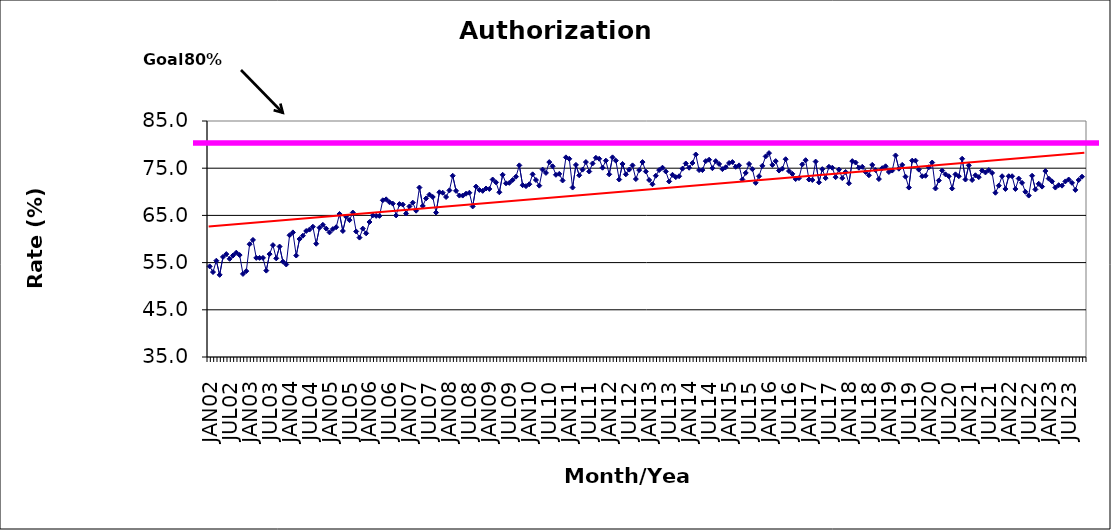
| Category | Series 0 |
|---|---|
| JAN02 | 54.2 |
| FEB02 | 53 |
| MAR02 | 55.4 |
| APR02 | 52.4 |
| MAY02 | 56.2 |
| JUN02 | 56.8 |
| JUL02 | 55.8 |
| AUG02 | 56.5 |
| SEP02 | 57.1 |
| OCT02 | 56.6 |
| NOV02 | 52.6 |
| DEC02 | 53.2 |
| JAN03 | 58.9 |
| FEB03 | 59.8 |
| MAR03 | 56 |
| APR03 | 56 |
| MAY03 | 56 |
| JUN03 | 53.3 |
| JUL03 | 56.8 |
| AUG03 | 58.7 |
| SEP03 | 55.9 |
| OCT03 | 58.4 |
| NOV03 | 55.2 |
| DEC03 | 54.6 |
| JAN04 | 60.8 |
| FEB04 | 61.4 |
| MAR04 | 56.5 |
| APR04 | 60 |
| MAY04 | 60.7 |
| JUN04 | 61.7 |
| JUL04 | 62 |
| AUG04 | 62.6 |
| SEP04 | 59 |
| OCT04 | 62.4 |
| NOV04 | 63 |
| DEC04 | 62.2 |
| JAN05 | 61.4 |
| FEB05 | 62.1 |
| MAR05 | 62.5 |
| APR05 | 65.3 |
| MAY05 | 61.7 |
| JUN05 | 64.7 |
| JUL05 | 64 |
| AUG05 | 65.6 |
| SEP05 | 61.6 |
| OCT05 | 60.3 |
| NOV05 | 62.2 |
| DEC05 | 61.2 |
| JAN06 | 63.6 |
| FEB06 | 65 |
| MAR06 | 64.9 |
| APR06 | 64.9 |
| MAY06 | 68.2 |
| JUN06 | 68.4 |
| JUL06 | 67.8 |
| AUG06 | 67.5 |
| SEP06 | 65 |
| OCT06 | 67.4 |
| NOV06 | 67.3 |
| DEC06 | 65.4 |
| JAN07 | 66.9 |
| FEB07 | 67.7 |
| MAR07 | 66 |
| APR07 | 70.9 |
| MAY07 | 67 |
| JUN07 | 68.6 |
| JUL07 | 69.4 |
| AUG07 | 68.9 |
| SEP07 | 65.6 |
| OCT07 | 69.9 |
| NOV07 | 69.8 |
| DEC07 | 68.9 |
| JAN08 | 70.3 |
| FEB08 | 73.4 |
| MAR08 | 70.2 |
| APR08 | 69.2 |
| MAY08 | 69.2 |
| JUN08 | 69.6 |
| JUL08 | 69.8 |
| AUG08 | 66.9 |
| SEP08 | 71.1 |
| OCT08 | 70.4 |
| NOV08 | 70.2 |
| DEC08 | 70.7 |
| JAN09 | 70.6 |
| FEB09 | 72.6 |
| MAR09 | 72 |
| APR09 | 69.9 |
| MAY09 | 73.6 |
| JUN09 | 71.8 |
| JUL09 | 71.9 |
| AUG09 | 72.5 |
| SEP09 | 73.2 |
| OCT09 | 75.6 |
| NOV09 | 71.4 |
| DEC09 | 71.2 |
| JAN10 | 71.6 |
| FEB10 | 73.7 |
| MAR10 | 72.5 |
| APR10 | 71.3 |
| MAY10 | 74.7 |
| JUN10 | 74 |
| JUL10 | 76.3 |
| AUG10 | 75.4 |
| SEP10 | 73.6 |
| OCT10 | 73.8 |
| NOV10 | 72.4 |
| DEC10 | 77.3 |
| JAN11 | 77 |
| FEB11 | 70.9 |
| MAR11 | 75.7 |
| APR11 | 73.5 |
| MAY11 | 74.7 |
| JUN11 | 76.3 |
| JUL11 | 74.3 |
| AUG11 | 76 |
| SEP11 | 77.2 |
| OCT11 | 77 |
| NOV11 | 75.1 |
| DEC11 | 76.6 |
| JAN12 | 73.7 |
| FEB12 | 77.3 |
| MAR12 | 76.6 |
| APR12 | 72.6 |
| MAY12 | 75.9 |
| JUN12 | 73.7 |
| JUL12 | 74.7 |
| AUG12 | 75.6 |
| SEP12 | 72.7 |
| OCT12 | 74.6 |
| NOV12 | 76.3 |
| DEC12 | 74.3 |
| JAN13 | 72.5 |
| FEB13 | 71.6 |
| MAR13 | 73.4 |
| APR13 | 74.6 |
| MAY13 | 75.1 |
| JUN13 | 74.3 |
| JUL13 | 72.2 |
| AUG13 | 73.6 |
| SEP13 | 73.1 |
| OCT13 | 73.3 |
| NOV13 | 74.9 |
| DEC13 | 76 |
| JAN14 | 75.1 |
| FEB14 | 76.1 |
| MAR14 | 77.9 |
| APR14 | 74.6 |
| MAY14 | 74.6 |
| JUN14 | 76.5 |
| JUL14 | 76.8 |
| AUG14 | 75 |
| SEP14 | 76.5 |
| OCT14 | 75.9 |
| NOV14 | 74.8 |
| DEC14 | 75.2 |
| JAN15 | 76.1 |
| FEB15 | 76.3 |
| MAR15 | 75.3 |
| APR15 | 75.6 |
| MAY15 | 72.6 |
| JUN15 | 74 |
| JUL15 | 75.9 |
| AUG15 | 74.8 |
| SEP15 | 71.9 |
| OCT15 | 73.3 |
| NOV15 | 75.5 |
| DEC15 | 77.5 |
| JAN16 | 78.2 |
| FEB16 | 75.7 |
| MAR16 | 76.5 |
| APR16 | 74.5 |
| MAY16 | 74.9 |
| JUN16 | 76.9 |
| JUL16 | 74.4 |
| AUG16 | 73.8 |
| SEP16 | 72.7 |
| OCT16 | 72.9 |
| NOV16 | 75.8 |
| DEC16 | 76.7 |
| JAN17 | 72.6 |
| FEB17 | 72.5 |
| MAR17 | 76.4 |
| APR17 | 72 |
| MAY17 | 74.8 |
| JUN17 | 72.9 |
| JUL17 | 75.3 |
| AUG17 | 75.1 |
| SEP17 | 73.1 |
| OCT17 | 74.7 |
| NOV17 | 72.9 |
| DEC17 | 74.2 |
| JAN18 | 71.8 |
| FEB18 | 76.5 |
| MAR18 | 76.2 |
| APR18 | 75.1 |
| MAY18 | 75.3 |
| JUN18 | 74.2 |
| JUL18 | 73.5 |
| AUG18 | 75.7 |
| SEP18 | 74.6 |
| OCT18 | 72.7 |
| NOV18 | 75 |
| DEC18 | 75.4 |
| JAN19 | 74.2 |
| FEB19 | 74.5 |
| MAR19 | 77.7 |
| APR19 | 74.9 |
| MAY19 | 75.7 |
| JUN19 | 73.2 |
| JUL19 | 70.9 |
| AUG19 | 76.6 |
| SEP19 | 76.6 |
| OCT19 | 74.7 |
| NOV19 | 73.3 |
| DEC19 | 73.4 |
| JAN20 | 75.2 |
| FEB20 | 76.2 |
| MAR20 | 70.7 |
| APR20 | 72.4 |
| MAY20 | 74.5 |
| JUN20 | 73.7 |
| JUL20 | 73.3 |
| AUG20 | 70.7 |
| SEP20 | 73.7 |
| OCT20 | 73.3 |
| NOV20 | 77 |
| DEC20 | 72.6 |
| JAN21 | 75.6 |
| FEB21 | 72.5 |
| MAR21 | 73.5 |
| APR21 | 73.1 |
| MAY21 | 74.5 |
| JUN21 | 74.1 |
| JUL21 | 74.6 |
| AUG21 | 74 |
| SEP21 | 69.8 |
| OCT21 | 71.3 |
| NOV21 | 73.3 |
| DEC21 | 70.6 |
| JAN22 | 73.3 |
| FEB22 | 73.3 |
| MAR22 | 70.6 |
| APR22 | 72.8 |
| MAY22 | 71.9 |
| JUN22 | 70 |
| JUL22 | 69.2 |
| AUG22 | 73.4 |
| SEP22 | 70.5 |
| OCT22 | 71.7 |
| NOV22 | 71.1 |
| DEC22 | 74.4 |
| JAN23 | 72.8 |
| FEB23 | 72.2 |
| MAR23 | 70.9 |
| APR23 | 71.4 |
| MAY23 | 71.3 |
| JUN23 | 72.2 |
| JUL23 | 72.6 |
| AUG23 | 71.9 |
| SEP23 | 70.4 |
| OCT23 | 72.5 |
| NOV23 | 73.2 |